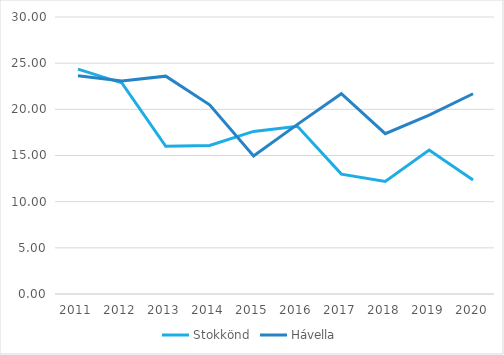
| Category | Stokkönd | Hávella |
|---|---|---|
| 2011.0 | 24.361 | 23.637 |
| 2012.0 | 22.861 | 23.081 |
| 2013.0 | 15.99 | 23.594 |
| 2014.0 | 16.091 | 20.489 |
| 2015.0 | 17.61 | 14.95 |
| 2016.0 | 18.164 | 18.372 |
| 2017.0 | 12.985 | 21.692 |
| 2018.0 | 12.197 | 17.364 |
| 2019.0 | 15.582 | 19.382 |
| 2020.0 | 12.341 | 21.687 |